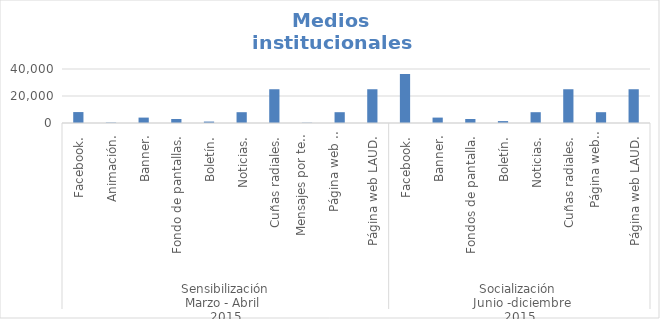
| Category | Series 0 |
|---|---|
| 0 | 8096 |
| 1 | 301 |
| 2 | 4000 |
| 3 | 2961 |
| 4 | 1063 |
| 5 | 8000 |
| 6 | 25000 |
| 7 | 200 |
| 8 | 8000 |
| 9 | 25000 |
| 10 | 36297 |
| 11 | 4000 |
| 12 | 2961 |
| 13 | 1409 |
| 14 | 8000 |
| 15 | 25000 |
| 16 | 8000 |
| 17 | 25000 |